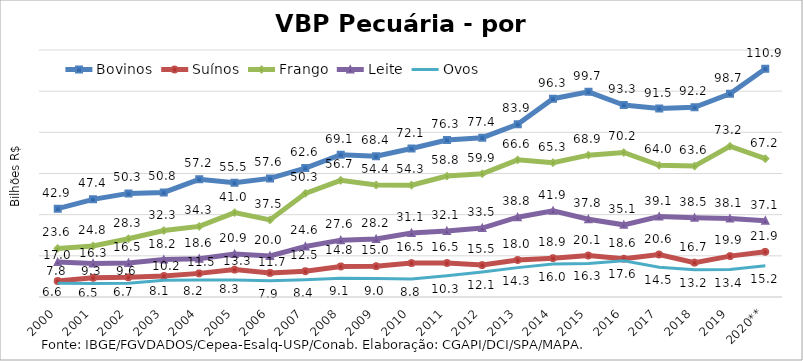
| Category | Bovinos | Suínos | Frango | Leite | Ovos |
|---|---|---|---|---|---|
| 2000 | 42.914 | 7.77 | 23.614 | 16.951 | 6.628 |
| 2001 | 47.438 | 9.322 | 24.82 | 16.311 | 6.531 |
| 2002 | 50.341 | 9.555 | 28.331 | 16.517 | 6.729 |
| 2003 | 50.807 | 10.211 | 32.3 | 18.188 | 8.139 |
| 2004 | 57.164 | 11.481 | 34.298 | 18.589 | 8.249 |
| 2005 | 55.498 | 13.311 | 41.006 | 20.908 | 8.305 |
| 2006 | 57.62 | 11.709 | 37.461 | 19.971 | 7.889 |
| 2007 | 62.62 | 12.52 | 50.332 | 24.551 | 8.385 |
| 2008 | 69.14 | 14.825 | 56.657 | 27.618 | 9.055 |
| 2009 | 68.419 | 14.986 | 54.399 | 28.157 | 9.029 |
| 2010 | 72.134 | 16.486 | 54.333 | 31.096 | 8.781 |
| 2011 | 76.257 | 16.512 | 58.764 | 32.056 | 10.347 |
| 2012 | 77.393 | 15.504 | 59.861 | 33.497 | 12.13 |
| 2013 | 83.867 | 17.951 | 66.626 | 38.763 | 14.266 |
| 2014 | 96.348 | 18.855 | 65.278 | 41.859 | 16.029 |
| 2015 | 99.664 | 20.15 | 68.914 | 37.785 | 16.32 |
| 2016 | 93.29 | 18.595 | 70.218 | 35.06 | 17.594 |
| 2017 | 91.548 | 20.643 | 63.957 | 39.064 | 14.502 |
| 2018 | 92.162 | 16.718 | 63.608 | 38.483 | 13.188 |
| 2019 | 98.685 | 19.871 | 73.238 | 38.126 | 13.356 |
| 2020** | 110.869 | 21.946 | 67.188 | 37.085 | 15.185 |